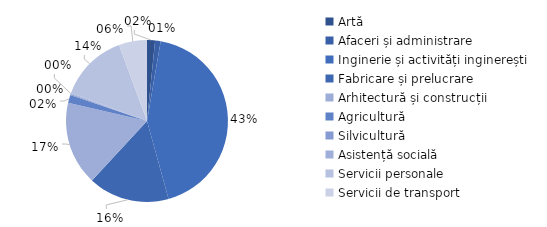
| Category | Series 0 |
|---|---|
| Artă | 1.6 |
| Afaceri și administrare | 1.1 |
| Inginerie și activități inginerești | 43 |
| Fabricare și prelucrare | 16.2 |
| Arhitectură și construcții | 16.7 |
| Agricultură | 1.6 |
| Silvicultură | 0.2 |
| Asistență socială | 0.2 |
| Servicii personale | 13.8 |
| Servicii de transport | 5.6 |